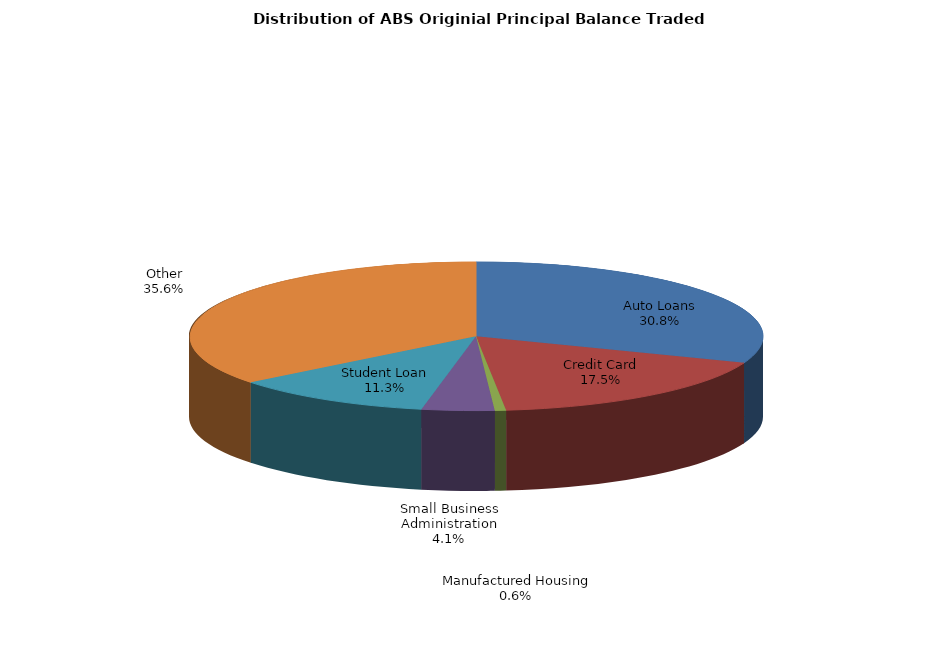
| Category | Series 0 |
|---|---|
| Auto Loans | 719050233.716 |
| Credit Card | 408458692.163 |
| Manufactured Housing | 14744059.98 |
| Small Business Administration | 95205982.313 |
| Student Loan | 263823748.912 |
| Other | 831708721.471 |